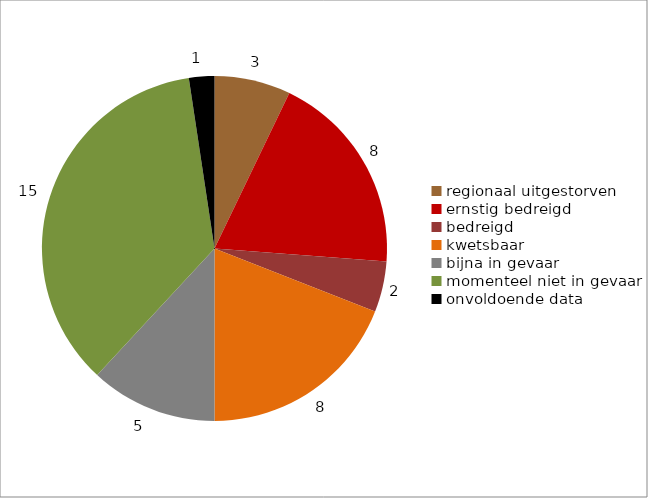
| Category | Series 0 |
|---|---|
| regionaal uitgestorven | 3 |
| ernstig bedreigd | 8 |
| bedreigd | 2 |
| kwetsbaar | 8 |
| bijna in gevaar | 5 |
| momenteel niet in gevaar | 15 |
| onvoldoende data | 1 |